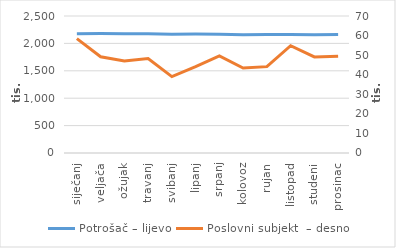
| Category | Potrošač – lijevo |
|---|---|
| siječanj | 2174090 |
| veljača | 2178943 |
| ožujak | 2178335 |
| travanj | 2175711 |
| svibanj | 2166246 |
| lipanj | 2169329 |
| srpanj | 2165255 |
| kolovoz | 2158610 |
| rujan | 2164436 |
| listopad | 2164454 |
| studeni | 2157049 |
| prosinac | 2162295 |